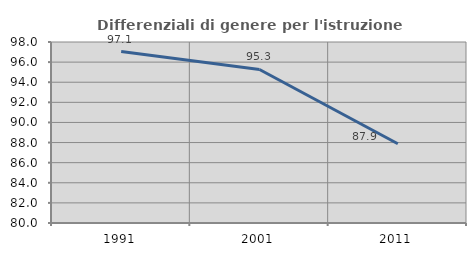
| Category | Differenziali di genere per l'istruzione superiore |
|---|---|
| 1991.0 | 97.055 |
| 2001.0 | 95.269 |
| 2011.0 | 87.879 |